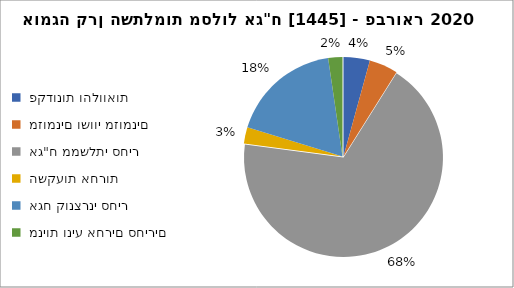
| Category | אומגה קרן השתלמות מסלול אג"ח [1445] - פברואר 2020 |
|---|---|
|  פקדונות והלוואות  | 2885 |
|  מזומנים ושווי מזומנים   | 3141 |
|  אג"ח ממשלתי סחיר  | 45987 |
|  השקעות אחרות  | 1771 |
|  אגח קונצרני סחיר  | 12116 |
|  מניות וניע אחרים סחירים   | 1558 |